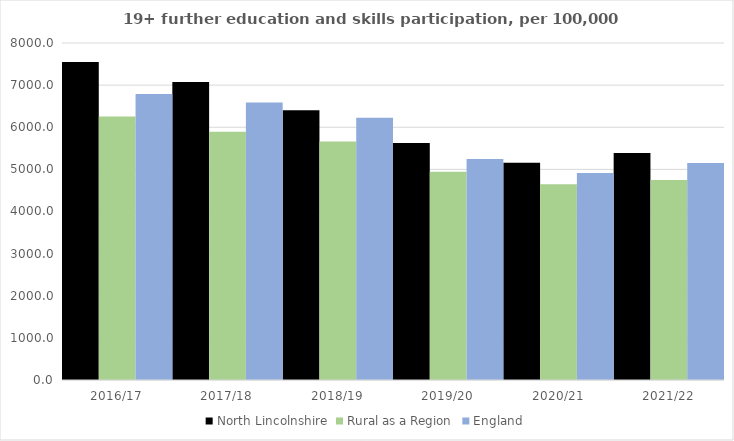
| Category | North Lincolnshire | Rural as a Region | England |
|---|---|---|---|
| 2016/17 | 7550 | 6253.401 | 6788 |
| 2017/18 | 7076 | 5892.029 | 6588 |
| 2018/19 | 6405 | 5661.873 | 6227 |
| 2019/20 | 5625 | 4943.801 | 5244 |
| 2020/21 | 5158 | 4646.727 | 4913 |
| 2021/22 | 5391 | 4747.049 | 5151 |